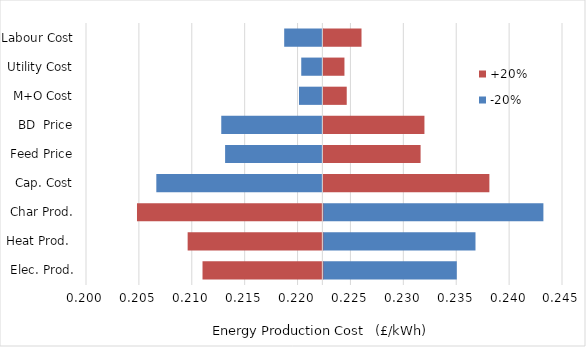
| Category | -20% | +20% |
|---|---|---|
| Elec. Prod. | 0.235 | 0.211 |
| Heat Prod.  | 0.237 | 0.21 |
| Char Prod. | 0.243 | 0.205 |
| Cap. Cost | 0.207 | 0.238 |
| Feed Price | 0.213 | 0.232 |
| BD  Price | 0.213 | 0.232 |
| M+O Cost | 0.22 | 0.225 |
| Utility Cost | 0.22 | 0.224 |
| Labour Cost | 0.219 | 0.226 |